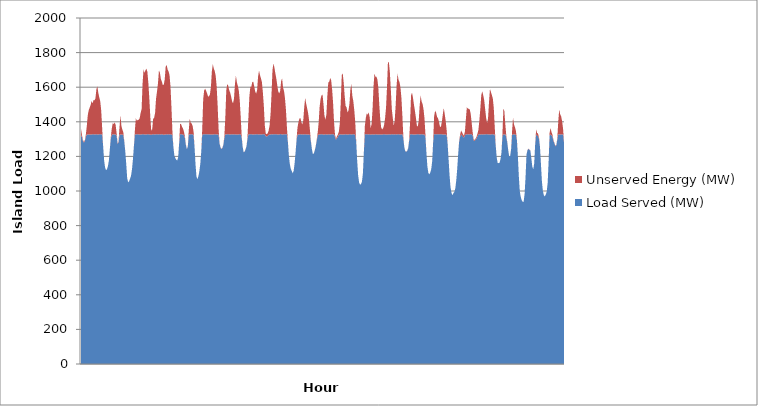
| Category | Load Served (MW) | Unserved Energy (MW) |
|---|---|---|
| 0 | 1324.409 | 35.635 |
| 1 | 1310.499 | 12.958 |
| 2 | 1289.653 | 6.128 |
| 3 | 1280.331 | 4.523 |
| 4 | 1288.718 | 5.299 |
| 5 | 1312.894 | 12.291 |
| 6 | 1326.822 | 46.878 |
| 7 | 1326.827 | 109.461 |
| 8 | 1327.036 | 139.633 |
| 9 | 1326.175 | 155.354 |
| 10 | 1326 | 171.268 |
| 11 | 1326.669 | 194.153 |
| 12 | 1327.602 | 178.88 |
| 13 | 1327.744 | 197.708 |
| 14 | 1327.151 | 197.417 |
| 15 | 1327.288 | 207.652 |
| 16 | 1327.655 | 259.866 |
| 17 | 1327.026 | 278.056 |
| 18 | 1326.765 | 240.406 |
| 19 | 1328.042 | 212.689 |
| 20 | 1327.967 | 190.502 |
| 21 | 1327.357 | 138.164 |
| 22 | 1326.974 | 36.562 |
| 23 | 1258.902 | 2.451 |
| 24 | 1178.693 | 0.196 |
| 25 | 1136.652 | 0.061 |
| 26 | 1120.948 | 0.034 |
| 27 | 1125.334 | 0.059 |
| 28 | 1144.339 | 0.13 |
| 29 | 1177.168 | 0.153 |
| 30 | 1243.282 | 1.73 |
| 31 | 1303.993 | 9.019 |
| 32 | 1326.199 | 35.368 |
| 33 | 1326.292 | 65.984 |
| 34 | 1328.278 | 57.906 |
| 35 | 1326.634 | 70.266 |
| 36 | 1327.106 | 55.05 |
| 37 | 1319.5 | 14.957 |
| 38 | 1273.039 | 4.058 |
| 39 | 1279.655 | 3.966 |
| 40 | 1327.33 | 40.133 |
| 41 | 1326.875 | 110.864 |
| 42 | 1326.786 | 49.654 |
| 43 | 1326.14 | 28.689 |
| 44 | 1322.03 | 17.222 |
| 45 | 1284.248 | 4.884 |
| 46 | 1229.905 | 1.016 |
| 47 | 1157.759 | 0.069 |
| 48 | 1073.89 | 0.017 |
| 49 | 1050.274 | 0.008 |
| 50 | 1055.876 | 0 |
| 51 | 1071.552 | 0.027 |
| 52 | 1088.44 | 0.019 |
| 53 | 1125.37 | 0.026 |
| 54 | 1183.858 | 0.377 |
| 55 | 1259.537 | 2.494 |
| 56 | 1325.442 | 25.307 |
| 57 | 1327.149 | 93.757 |
| 58 | 1327.507 | 79.408 |
| 59 | 1328.693 | 82.14 |
| 60 | 1327.05 | 84.369 |
| 61 | 1326.507 | 95.146 |
| 62 | 1326.379 | 125.955 |
| 63 | 1327.109 | 146.779 |
| 64 | 1328.207 | 293.665 |
| 65 | 1328.289 | 375.224 |
| 66 | 1326.838 | 355.642 |
| 67 | 1326.595 | 372.006 |
| 68 | 1326.562 | 380.374 |
| 69 | 1328.475 | 359.839 |
| 70 | 1327.422 | 296.506 |
| 71 | 1327.18 | 209.03 |
| 72 | 1326.448 | 104.681 |
| 73 | 1324.582 | 23.144 |
| 74 | 1326.921 | 29.869 |
| 75 | 1327.852 | 88.613 |
| 76 | 1327.22 | 96.772 |
| 77 | 1327.131 | 123.901 |
| 78 | 1327.562 | 207.146 |
| 79 | 1328.132 | 246.597 |
| 80 | 1326.859 | 295.331 |
| 81 | 1327.931 | 369.435 |
| 82 | 1327.363 | 355.939 |
| 83 | 1326.775 | 320.5 |
| 84 | 1327.952 | 304.932 |
| 85 | 1326.825 | 285.77 |
| 86 | 1325.211 | 289.148 |
| 87 | 1326.638 | 317.665 |
| 88 | 1327.074 | 391.539 |
| 89 | 1327.706 | 400.896 |
| 90 | 1326.224 | 376.845 |
| 91 | 1328.222 | 363.177 |
| 92 | 1326.241 | 343.435 |
| 93 | 1329.053 | 275.923 |
| 94 | 1326.127 | 157.286 |
| 95 | 1323.098 | 22.077 |
| 96 | 1256.779 | 2.262 |
| 97 | 1205.947 | 0.368 |
| 98 | 1190.447 | 0.235 |
| 99 | 1180.416 | 0.319 |
| 100 | 1176.011 | 0.294 |
| 101 | 1195.67 | 0.449 |
| 102 | 1274.399 | 3.887 |
| 103 | 1327.754 | 60.711 |
| 104 | 1328.229 | 58.521 |
| 105 | 1327.139 | 43.935 |
| 106 | 1327.148 | 34.498 |
| 107 | 1321.402 | 21.506 |
| 108 | 1305.579 | 8.822 |
| 109 | 1266.233 | 3.232 |
| 110 | 1241.912 | 1.468 |
| 111 | 1255.599 | 2.508 |
| 112 | 1325.185 | 25.447 |
| 113 | 1327.418 | 91.671 |
| 114 | 1327.425 | 67.572 |
| 115 | 1327.308 | 62.911 |
| 116 | 1328.094 | 48.425 |
| 117 | 1322.195 | 19.813 |
| 118 | 1254.158 | 2.258 |
| 119 | 1155.492 | 0.14 |
| 120 | 1082.936 | 0.005 |
| 121 | 1068.35 | 0.004 |
| 122 | 1086.03 | 0.006 |
| 123 | 1114.191 | 0.027 |
| 124 | 1157.653 | 0.147 |
| 125 | 1229.371 | 1.218 |
| 126 | 1326.599 | 30.657 |
| 127 | 1327.344 | 203.197 |
| 128 | 1327.371 | 254.142 |
| 129 | 1327.647 | 263.269 |
| 130 | 1327.759 | 251.726 |
| 131 | 1327.742 | 237.488 |
| 132 | 1327.166 | 219.964 |
| 133 | 1327.712 | 218.851 |
| 134 | 1326.931 | 231.879 |
| 135 | 1326.655 | 273.744 |
| 136 | 1326.71 | 364.178 |
| 137 | 1326.524 | 407.028 |
| 138 | 1327.27 | 380.368 |
| 139 | 1327.732 | 365.45 |
| 140 | 1327.278 | 338 |
| 141 | 1325.837 | 277.474 |
| 142 | 1327.7 | 165.409 |
| 143 | 1326.845 | 30.486 |
| 144 | 1273.038 | 3.691 |
| 145 | 1250.882 | 2.05 |
| 146 | 1241.973 | 1.439 |
| 147 | 1249.023 | 1.916 |
| 148 | 1267.285 | 2.926 |
| 149 | 1306.7 | 9.749 |
| 150 | 1327.437 | 101.113 |
| 151 | 1327.114 | 255.611 |
| 152 | 1327.848 | 290.421 |
| 153 | 1327.653 | 281.132 |
| 154 | 1327.148 | 256.1 |
| 155 | 1326.802 | 241.932 |
| 156 | 1327.505 | 218.725 |
| 157 | 1327.182 | 191.594 |
| 158 | 1327.469 | 180.028 |
| 159 | 1327.145 | 206.337 |
| 160 | 1327.967 | 290.84 |
| 161 | 1326.24 | 339.81 |
| 162 | 1326.407 | 302.341 |
| 163 | 1325.939 | 281.46 |
| 164 | 1327.261 | 253.735 |
| 165 | 1327.413 | 194.873 |
| 166 | 1326.623 | 99.745 |
| 167 | 1307.475 | 10.775 |
| 168 | 1254.849 | 1.869 |
| 169 | 1224.607 | 0.746 |
| 170 | 1226.147 | 1.012 |
| 171 | 1240.417 | 1.274 |
| 172 | 1257.315 | 2.298 |
| 173 | 1300.685 | 8.705 |
| 174 | 1327.427 | 100.354 |
| 175 | 1327.259 | 219.57 |
| 176 | 1327.552 | 274.285 |
| 177 | 1327.602 | 275.114 |
| 178 | 1327.256 | 302.314 |
| 179 | 1325.829 | 305.75 |
| 180 | 1328.25 | 277.948 |
| 181 | 1326.853 | 249.454 |
| 182 | 1328.455 | 234.624 |
| 183 | 1328.033 | 253.225 |
| 184 | 1327.334 | 332.503 |
| 185 | 1327.007 | 369.451 |
| 186 | 1327.725 | 342.358 |
| 187 | 1326.754 | 325.107 |
| 188 | 1327.305 | 302.651 |
| 189 | 1327.583 | 242.642 |
| 190 | 1327.469 | 165.49 |
| 191 | 1328.115 | 52.701 |
| 192 | 1317.267 | 14.595 |
| 193 | 1315.228 | 13.118 |
| 194 | 1317.822 | 15.407 |
| 195 | 1323.93 | 25.039 |
| 196 | 1326.456 | 51.624 |
| 197 | 1327.103 | 117.123 |
| 198 | 1327.841 | 231.591 |
| 199 | 1327.079 | 372.03 |
| 200 | 1327.635 | 409.509 |
| 201 | 1327.824 | 386.005 |
| 202 | 1327.448 | 352.069 |
| 203 | 1327.961 | 321.34 |
| 204 | 1327.08 | 282.507 |
| 205 | 1326.987 | 247.575 |
| 206 | 1326.94 | 236.985 |
| 207 | 1328.997 | 249.558 |
| 208 | 1328.434 | 307.309 |
| 209 | 1326.779 | 323.464 |
| 210 | 1327.21 | 270.189 |
| 211 | 1328.285 | 250.345 |
| 212 | 1327.861 | 208.17 |
| 213 | 1327.233 | 141.734 |
| 214 | 1327.682 | 40.398 |
| 215 | 1283.538 | 5.172 |
| 216 | 1207.681 | 0.369 |
| 217 | 1156.078 | 0.095 |
| 218 | 1129.122 | 0.046 |
| 219 | 1115.739 | 0.046 |
| 220 | 1102.39 | 0.01 |
| 221 | 1115.837 | 0.031 |
| 222 | 1160.58 | 0.105 |
| 223 | 1222.37 | 0.825 |
| 224 | 1292.359 | 6.297 |
| 225 | 1326.074 | 40.678 |
| 226 | 1327.355 | 71.311 |
| 227 | 1326.095 | 92.062 |
| 228 | 1327.969 | 94.159 |
| 229 | 1326.859 | 70.93 |
| 230 | 1328.155 | 56.557 |
| 231 | 1326.506 | 81.409 |
| 232 | 1327.243 | 158.656 |
| 233 | 1328.135 | 210.23 |
| 234 | 1326.583 | 178.582 |
| 235 | 1327.105 | 151.853 |
| 236 | 1327.064 | 124.657 |
| 237 | 1326.754 | 84.035 |
| 238 | 1323.935 | 22.364 |
| 239 | 1281.856 | 5.279 |
| 240 | 1240.691 | 1.068 |
| 241 | 1213.44 | 0.508 |
| 242 | 1217.214 | 0.744 |
| 243 | 1235.103 | 1.383 |
| 244 | 1259.571 | 2.291 |
| 245 | 1292.242 | 6.003 |
| 246 | 1321.756 | 16.653 |
| 247 | 1327.199 | 68.415 |
| 248 | 1326.301 | 160.294 |
| 249 | 1327.931 | 204.876 |
| 250 | 1327.487 | 226.091 |
| 251 | 1327.939 | 229.237 |
| 252 | 1325.707 | 177.596 |
| 253 | 1326.591 | 108.279 |
| 254 | 1328.065 | 84.445 |
| 255 | 1326.787 | 113.607 |
| 256 | 1326.423 | 222.211 |
| 257 | 1327.606 | 299.037 |
| 258 | 1326.843 | 304.744 |
| 259 | 1327.031 | 326.687 |
| 260 | 1328.335 | 311.785 |
| 261 | 1328.17 | 257.729 |
| 262 | 1327.257 | 180.187 |
| 263 | 1327.536 | 68.262 |
| 264 | 1311.892 | 12.23 |
| 265 | 1296.597 | 6.668 |
| 266 | 1305.106 | 10.202 |
| 267 | 1313.343 | 13.339 |
| 268 | 1324.687 | 19.162 |
| 269 | 1326.62 | 63.377 |
| 270 | 1327.718 | 189.851 |
| 271 | 1326.435 | 344.479 |
| 272 | 1327.346 | 352.446 |
| 273 | 1326.264 | 300.899 |
| 274 | 1327.212 | 223.608 |
| 275 | 1327.955 | 163.826 |
| 276 | 1326.969 | 156.054 |
| 277 | 1326.865 | 128.008 |
| 278 | 1326.494 | 139.267 |
| 279 | 1328.189 | 176.253 |
| 280 | 1327.441 | 262.269 |
| 281 | 1326.881 | 290.585 |
| 282 | 1327.36 | 222.505 |
| 283 | 1327.984 | 191.579 |
| 284 | 1326.931 | 140.85 |
| 285 | 1327.441 | 71.869 |
| 286 | 1286.145 | 5.71 |
| 287 | 1177.45 | 0.259 |
| 288 | 1092.974 | 0.017 |
| 289 | 1050.03 | 0.015 |
| 290 | 1036.572 | 0 |
| 291 | 1040.03 | 0 |
| 292 | 1054.838 | 0 |
| 293 | 1104.201 | 0.017 |
| 294 | 1230.013 | 0.963 |
| 295 | 1328.016 | 47.541 |
| 296 | 1327.541 | 95.262 |
| 297 | 1327.943 | 121.04 |
| 298 | 1328.222 | 112.378 |
| 299 | 1326.487 | 128.907 |
| 300 | 1328.547 | 97.465 |
| 301 | 1325.839 | 38.822 |
| 302 | 1326.957 | 60.056 |
| 303 | 1327.482 | 142.77 |
| 304 | 1326.772 | 277.125 |
| 305 | 1326.585 | 352.553 |
| 306 | 1328.184 | 332.067 |
| 307 | 1327.191 | 333.201 |
| 308 | 1326.502 | 318.671 |
| 309 | 1327.332 | 271.381 |
| 310 | 1326.791 | 171.864 |
| 311 | 1327.083 | 88.177 |
| 312 | 1326.621 | 39.125 |
| 313 | 1325.982 | 30.333 |
| 314 | 1327.44 | 34.935 |
| 315 | 1327.811 | 53.258 |
| 316 | 1327.144 | 92.901 |
| 317 | 1327.395 | 152.693 |
| 318 | 1326.349 | 270.688 |
| 319 | 1326.411 | 418.492 |
| 320 | 1327.784 | 415.634 |
| 321 | 1327.058 | 358.891 |
| 322 | 1327.136 | 257.86 |
| 323 | 1327.827 | 146.375 |
| 324 | 1326.958 | 96.258 |
| 325 | 1327.735 | 49.924 |
| 326 | 1326.917 | 79.37 |
| 327 | 1327.798 | 165.135 |
| 328 | 1326.611 | 284.196 |
| 329 | 1327.554 | 351.721 |
| 330 | 1327.557 | 314.871 |
| 331 | 1327.056 | 302.531 |
| 332 | 1326.106 | 272.992 |
| 333 | 1327.492 | 210.769 |
| 334 | 1328.121 | 105.631 |
| 335 | 1303.447 | 8.568 |
| 336 | 1252.488 | 2.019 |
| 337 | 1229.876 | 0.966 |
| 338 | 1226.872 | 0.963 |
| 339 | 1231.68 | 1.193 |
| 340 | 1246.672 | 1.682 |
| 341 | 1288.278 | 5.618 |
| 342 | 1326.894 | 67.07 |
| 343 | 1327.967 | 224.774 |
| 344 | 1327.8 | 241.197 |
| 345 | 1326.873 | 212.574 |
| 346 | 1327.248 | 173.509 |
| 347 | 1326.164 | 138.672 |
| 348 | 1326.974 | 99.581 |
| 349 | 1328.015 | 51.094 |
| 350 | 1327.559 | 44.199 |
| 351 | 1328.022 | 79.911 |
| 352 | 1326.094 | 170.852 |
| 353 | 1327.366 | 225.171 |
| 354 | 1327.535 | 189.18 |
| 355 | 1327.284 | 175.448 |
| 356 | 1327.286 | 144.601 |
| 357 | 1326.989 | 91.619 |
| 358 | 1310.659 | 11.82 |
| 359 | 1219.34 | 0.685 |
| 360 | 1141.107 | 0.12 |
| 361 | 1104.351 | 0.04 |
| 362 | 1096.321 | 0.043 |
| 363 | 1106.5 | 0.004 |
| 364 | 1126.586 | 0.063 |
| 365 | 1173.006 | 0.214 |
| 366 | 1285.562 | 5.15 |
| 367 | 1327.964 | 104.798 |
| 368 | 1328.092 | 135.706 |
| 369 | 1327.722 | 126.708 |
| 370 | 1327.575 | 101.588 |
| 371 | 1327.976 | 92.69 |
| 372 | 1327.58 | 73.694 |
| 373 | 1328.199 | 44.548 |
| 374 | 1327.624 | 42.661 |
| 375 | 1327.606 | 71.047 |
| 376 | 1326.67 | 114.769 |
| 377 | 1326.743 | 153.068 |
| 378 | 1327.228 | 117.815 |
| 379 | 1326.99 | 77.898 |
| 380 | 1324.413 | 27.078 |
| 381 | 1273.492 | 3.519 |
| 382 | 1185.024 | 0.273 |
| 383 | 1092.04 | 0.007 |
| 384 | 1023.34 | 0.012 |
| 385 | 989.734 | 0 |
| 386 | 976.267 | 0 |
| 387 | 987.363 | 0 |
| 388 | 995.117 | 0 |
| 389 | 1015.379 | 0 |
| 390 | 1061.375 | 0.011 |
| 391 | 1129.225 | 0.053 |
| 392 | 1215.003 | 0.753 |
| 393 | 1285.182 | 5.232 |
| 394 | 1312.942 | 12.578 |
| 395 | 1326.436 | 23.066 |
| 396 | 1321.96 | 18.074 |
| 397 | 1314.463 | 12.518 |
| 398 | 1308.963 | 11.546 |
| 399 | 1322.762 | 20.8 |
| 400 | 1326.586 | 89.476 |
| 401 | 1327.099 | 156.566 |
| 402 | 1328.249 | 148.128 |
| 403 | 1326.233 | 149.225 |
| 404 | 1328.066 | 143.74 |
| 405 | 1327.622 | 118.812 |
| 406 | 1327.355 | 67.674 |
| 407 | 1322.221 | 19.236 |
| 408 | 1293.67 | 6.816 |
| 409 | 1288.886 | 5.88 |
| 410 | 1295.721 | 7.208 |
| 411 | 1303.311 | 9.45 |
| 412 | 1316.709 | 14.166 |
| 413 | 1325.555 | 27.656 |
| 414 | 1328.103 | 78.858 |
| 415 | 1326.467 | 147.787 |
| 416 | 1327.675 | 226.621 |
| 417 | 1326.606 | 249.906 |
| 418 | 1327.332 | 226.995 |
| 419 | 1327.554 | 199.107 |
| 420 | 1326.796 | 148.752 |
| 421 | 1328.897 | 95.175 |
| 422 | 1327.229 | 65.596 |
| 423 | 1327.803 | 90.462 |
| 424 | 1326.79 | 183.972 |
| 425 | 1327.243 | 262.571 |
| 426 | 1327.004 | 245.454 |
| 427 | 1327.666 | 227.484 |
| 428 | 1327.641 | 206.362 |
| 429 | 1326.31 | 151.973 |
| 430 | 1327.691 | 40.885 |
| 431 | 1263.13 | 2.651 |
| 432 | 1193.719 | 0.424 |
| 433 | 1162.897 | 0.174 |
| 434 | 1160.675 | 0.156 |
| 435 | 1163.043 | 0.114 |
| 436 | 1184.68 | 0.206 |
| 437 | 1222.856 | 0.931 |
| 438 | 1318.372 | 14.3 |
| 439 | 1326.802 | 150.246 |
| 440 | 1327.135 | 134.025 |
| 441 | 1328.174 | 55.243 |
| 442 | 1310.275 | 9.594 |
| 443 | 1279.914 | 4.729 |
| 444 | 1235.704 | 1.414 |
| 445 | 1199.838 | 0.352 |
| 446 | 1201.879 | 0.405 |
| 447 | 1241.623 | 1.509 |
| 448 | 1323.181 | 22.07 |
| 449 | 1327.606 | 97.087 |
| 450 | 1327.65 | 57.959 |
| 451 | 1326.904 | 42.255 |
| 452 | 1323.867 | 23.002 |
| 453 | 1294.347 | 6.585 |
| 454 | 1204.672 | 0.343 |
| 455 | 1087.21 | 0.009 |
| 456 | 999.528 | 0 |
| 457 | 966.095 | 0 |
| 458 | 947.048 | 0 |
| 459 | 938.175 | 0 |
| 460 | 937.036 | 0 |
| 461 | 981.638 | 0 |
| 462 | 1080.058 | 0 |
| 463 | 1211.326 | 0.746 |
| 464 | 1235.885 | 1.538 |
| 465 | 1242.879 | 1.85 |
| 466 | 1239.063 | 1.366 |
| 467 | 1233.164 | 1.178 |
| 468 | 1189.786 | 0.35 |
| 469 | 1141.072 | 0.143 |
| 470 | 1125.709 | 0.037 |
| 471 | 1159.585 | 0.234 |
| 472 | 1270.084 | 3.318 |
| 473 | 1327.152 | 27.136 |
| 474 | 1319.844 | 15.974 |
| 475 | 1316.897 | 14.898 |
| 476 | 1301.197 | 8.009 |
| 477 | 1254.502 | 2.403 |
| 478 | 1157.218 | 0.118 |
| 479 | 1055.898 | 0.001 |
| 480 | 1000.428 | 0 |
| 481 | 975.988 | 0 |
| 482 | 968.184 | 0 |
| 483 | 979.33 | 0 |
| 484 | 996.113 | 0 |
| 485 | 1047.826 | 0 |
| 486 | 1175.238 | 0.231 |
| 487 | 1319.962 | 16.738 |
| 488 | 1326.614 | 37.437 |
| 489 | 1321.05 | 19.303 |
| 490 | 1312.916 | 11.529 |
| 491 | 1288.862 | 5.759 |
| 492 | 1274.74 | 3.897 |
| 493 | 1259.187 | 2.829 |
| 494 | 1264.126 | 2.759 |
| 495 | 1297.248 | 7.185 |
| 496 | 1328.149 | 73.491 |
| 497 | 1327.365 | 144.185 |
| 498 | 1326.128 | 117.041 |
| 499 | 1327.626 | 104.41 |
| 500 | 1326.471 | 77.532 |
| 501 | 1327.403 | 32.351 |
| 502 | 1278.456 | 4.581 |
| 503 | 1186.805 | 0.365 |